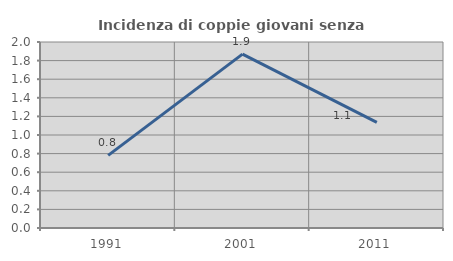
| Category | Incidenza di coppie giovani senza figli |
|---|---|
| 1991.0 | 0.781 |
| 2001.0 | 1.869 |
| 2011.0 | 1.136 |